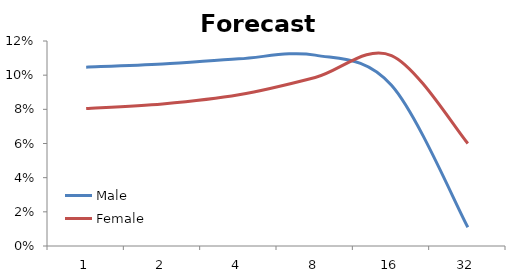
| Category | Male | Female |
|---|---|---|
| 1.0 | 0.105 | 0.08 |
| 2.0 | 0.107 | 0.083 |
| 4.0 | 0.11 | 0.088 |
| 8.0 | 0.112 | 0.099 |
| 16.0 | 0.094 | 0.112 |
| 32.0 | 0.011 | 0.06 |